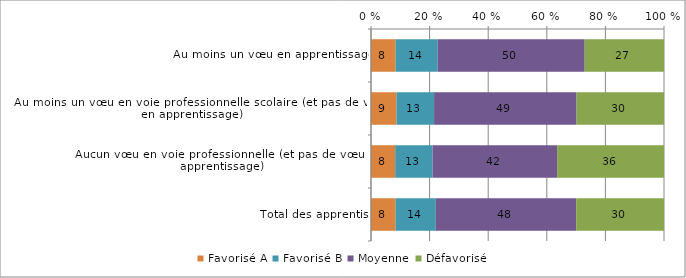
| Category | Favorisé A | Favorisé B | Moyenne | Défavorisé |
|---|---|---|---|---|
| Au moins un vœu en apprentissage | 8.416 | 14.346 | 50.172 | 27.066 |
| Au moins un vœu en voie professionnelle scolaire (et pas de vœu en apprentissage) | 8.697 | 12.837 | 48.631 | 29.836 |
| Aucun vœu en voie professionnelle (et pas de vœu en apprentissage) | 8.259 | 12.767 | 42.496 | 36.478 |
| Total des apprentis | 8.415 | 13.709 | 47.915 | 29.961 |